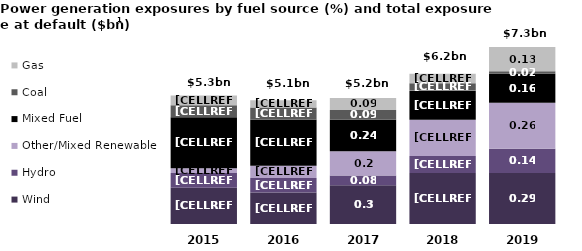
| Category | Wind | Hydro | Other/Mixed Renewable | Mixed Fuel | Coal | Gas |
|---|---|---|---|---|---|---|
| 2019.0 | 2.1 | 1 | 1.9 | 1.2 | 0.1 | 1 |
| 2018.0 | 2.1 | 0.7 | 1.5 | 1.2 | 0.3 | 0.4 |
| 2017.0 | 1.6 | 0.4 | 1 | 1.3 | 0.4 | 0.5 |
| 2016.0 | 1.3 | 0.6 | 0.5 | 1.9 | 0.5 | 0.3 |
| 2015.0 | 1.5 | 0.6 | 0.2 | 2.1 | 0.5 | 0.4 |